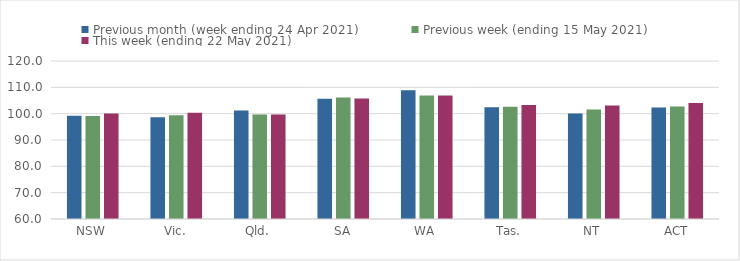
| Category | Previous month (week ending 24 Apr 2021) | Previous week (ending 15 May 2021) | This week (ending 22 May 2021) |
|---|---|---|---|
| NSW | 99.17 | 99.11 | 100.03 |
| Vic. | 98.62 | 99.42 | 100.34 |
| Qld. | 101.25 | 99.64 | 99.71 |
| SA | 105.67 | 106.17 | 105.79 |
| WA | 108.85 | 106.87 | 106.88 |
| Tas. | 102.45 | 102.66 | 103.31 |
| NT | 100.1 | 101.57 | 103.1 |
| ACT | 102.31 | 102.7 | 104.07 |